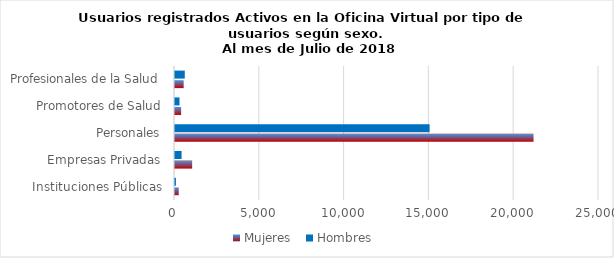
| Category | Mujeres | Hombres |
|---|---|---|
| Instituciones Públicas | 220 | 54 |
| Empresas Privadas | 1012 | 388 |
| Personales | 21140 | 15013 |
| Promotores de Salud | 361 | 266 |
| Profesionales de la Salud | 511 | 577 |